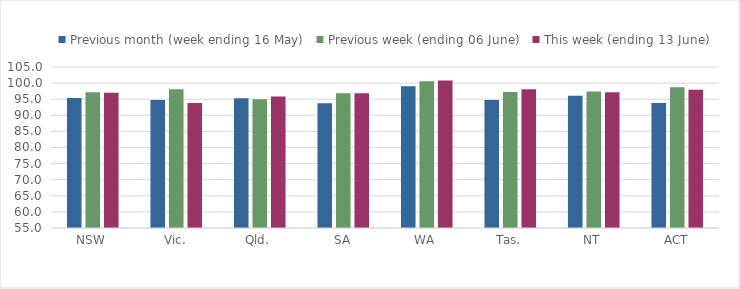
| Category | Previous month (week ending 16 May) | Previous week (ending 06 June) | This week (ending 13 June) |
|---|---|---|---|
| NSW | 95.338 | 97.16 | 97.022 |
| Vic. | 94.747 | 98.088 | 93.85 |
| Qld. | 95.305 | 94.961 | 95.804 |
| SA | 93.748 | 96.882 | 96.88 |
| WA | 98.983 | 100.554 | 100.813 |
| Tas. | 94.74 | 97.243 | 98.087 |
| NT | 96.097 | 97.385 | 97.138 |
| ACT | 93.796 | 98.711 | 97.941 |